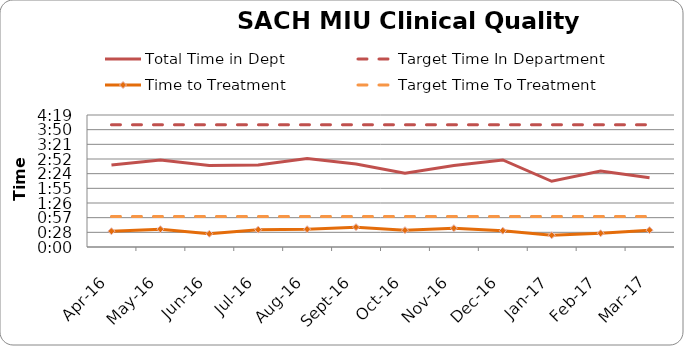
| Category | Total Time in Dept  | Target Time In Department | Time to Treatment | Target Time To Treatment |
|---|---|---|---|---|
| 2016-04-01 | 0.112 | 0.167 | 0.022 | 0.042 |
| 2016-05-01 | 0.119 | 0.167 | 0.024 | 0.042 |
| 2016-06-01 | 0.111 | 0.167 | 0.018 | 0.042 |
| 2016-07-01 | 0.112 | 0.167 | 0.024 | 0.042 |
| 2016-08-01 | 0.121 | 0.167 | 0.024 | 0.042 |
| 2016-09-01 | 0.113 | 0.167 | 0.027 | 0.042 |
| 2016-10-01 | 0.101 | 0.167 | 0.023 | 0.042 |
| 2016-11-01 | 0.111 | 0.167 | 0.026 | 0.042 |
| 2016-12-01 | 0.119 | 0.167 | 0.022 | 0.042 |
| 2017-01-01 | 0.09 | 0.167 | 0.016 | 0.042 |
| 2017-02-01 | 0.103 | 0.167 | 0.019 | 0.042 |
| 2017-03-01 | 0.094 | 0.167 | 0.023 | 0.042 |